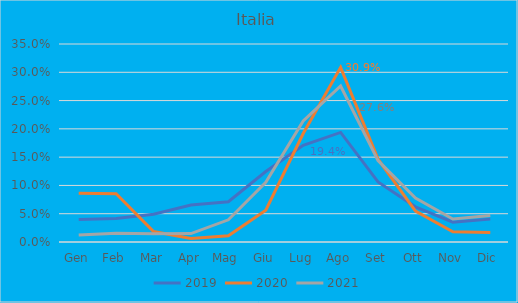
| Category | 2019 | 2020 | 2021 |
|---|---|---|---|
| Gen | 0.04 | 0.086 | 0.012 |
| Feb | 0.041 | 0.085 | 0.015 |
| Mar | 0.049 | 0.019 | 0.015 |
| Apr | 0.065 | 0.006 | 0.015 |
| Mag | 0.071 | 0.011 | 0.039 |
| Giu | 0.124 | 0.056 | 0.105 |
| Lug | 0.171 | 0.192 | 0.214 |
| Ago | 0.194 | 0.309 | 0.276 |
| Set | 0.106 | 0.146 | 0.144 |
| Ott | 0.062 | 0.055 | 0.078 |
| Nov | 0.035 | 0.018 | 0.041 |
| Dic | 0.04 | 0.017 | 0.047 |